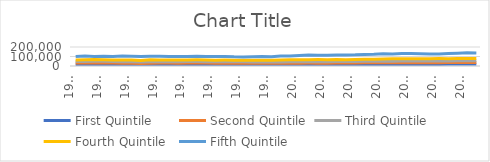
| Category | First Quintile | Second Quintile | Third Quintile | Fourth Quintile | Fifth Quintile |
|---|---|---|---|---|---|
| 1976.0 | 12300 | 30800 | 47400 | 63850 | 98800 |
| 1977.0 | 13350 | 30900 | 47650 | 65800 | 105600 |
| 1978.0 | 13650 | 31550 | 49850 | 67400 | 98950 |
| 1979.0 | 14950 | 31400 | 48700 | 64900 | 102050 |
| 1980.0 | 14600 | 31900 | 47700 | 63900 | 99500 |
| 1981.0 | 14500 | 29650 | 45600 | 63000 | 104200 |
| 1982.0 | 14050 | 28850 | 44400 | 62850 | 101350 |
| 1983.0 | 12500 | 26500 | 42000 | 58850 | 99200 |
| 1984.0 | 14200 | 29450 | 45800 | 64600 | 102450 |
| 1985.0 | 15050 | 31100 | 45900 | 64100 | 103150 |
| 1986.0 | 15200 | 31350 | 47100 | 63550 | 98800 |
| 1987.0 | 14550 | 28900 | 44300 | 63200 | 98800 |
| 1988.0 | 16100 | 31050 | 46250 | 63850 | 100050 |
| 1989.0 | 16200 | 31750 | 47250 | 64650 | 103800 |
| 1990.0 | 15750 | 30650 | 45900 | 63750 | 99700 |
| 1991.0 | 14950 | 29100 | 43700 | 61800 | 99000 |
| 1992.0 | 14700 | 28650 | 43800 | 61950 | 100550 |
| 1993.0 | 14350 | 28950 | 44400 | 61550 | 97100 |
| 1994.0 | 14400 | 28800 | 44000 | 60700 | 96000 |
| 1995.0 | 15000 | 28700 | 43350 | 60800 | 97650 |
| 1996.0 | 14450 | 28300 | 42800 | 60800 | 98750 |
| 1997.0 | 13450 | 27850 | 42750 | 60450 | 97600 |
| 1998.0 | 14400 | 28600 | 43250 | 62650 | 104900 |
| 1999.0 | 14900 | 30100 | 45400 | 64800 | 105700 |
| 2000.0 | 14500 | 30200 | 45650 | 65000 | 111650 |
| 2001.0 | 14800 | 30550 | 46900 | 66900 | 115950 |
| 2002.0 | 14700 | 29600 | 45900 | 67250 | 113250 |
| 2003.0 | 14600 | 30000 | 46000 | 66200 | 114250 |
| 2004.0 | 14950 | 30350 | 46600 | 67250 | 116300 |
| 2005.0 | 14250 | 30900 | 47150 | 65950 | 115100 |
| 2006.0 | 15000 | 31700 | 47700 | 67350 | 117200 |
| 2007.0 | 16400 | 32900 | 49550 | 70450 | 121550 |
| 2008.0 | 14900 | 33800 | 49950 | 71850 | 122600 |
| 2009.0 | 15350 | 34300 | 50700 | 74000 | 128550 |
| 2010.0 | 16250 | 33850 | 51250 | 75400 | 125900 |
| 2011.0 | 16900 | 34250 | 51700 | 75500 | 131900 |
| 2012.0 | 16050 | 34500 | 51800 | 75500 | 131150 |
| 2013.0 | 16750 | 34850 | 52200 | 75900 | 129750 |
| 2014.0 | 17900 | 35350 | 53250 | 77250 | 126800 |
| 2015.0 | 15650 | 33900 | 54400 | 77850 | 126000 |
| 2016.0 | 17450 | 35600 | 53300 | 76550 | 131400 |
| 2017.0 | 18000 | 36150 | 55600 | 78950 | 135100 |
| 2018.0 | 17750 | 36900 | 55850 | 79800 | 139300 |
| 2019.0 | 18350 | 37400 | 56350 | 77900 | 136900 |